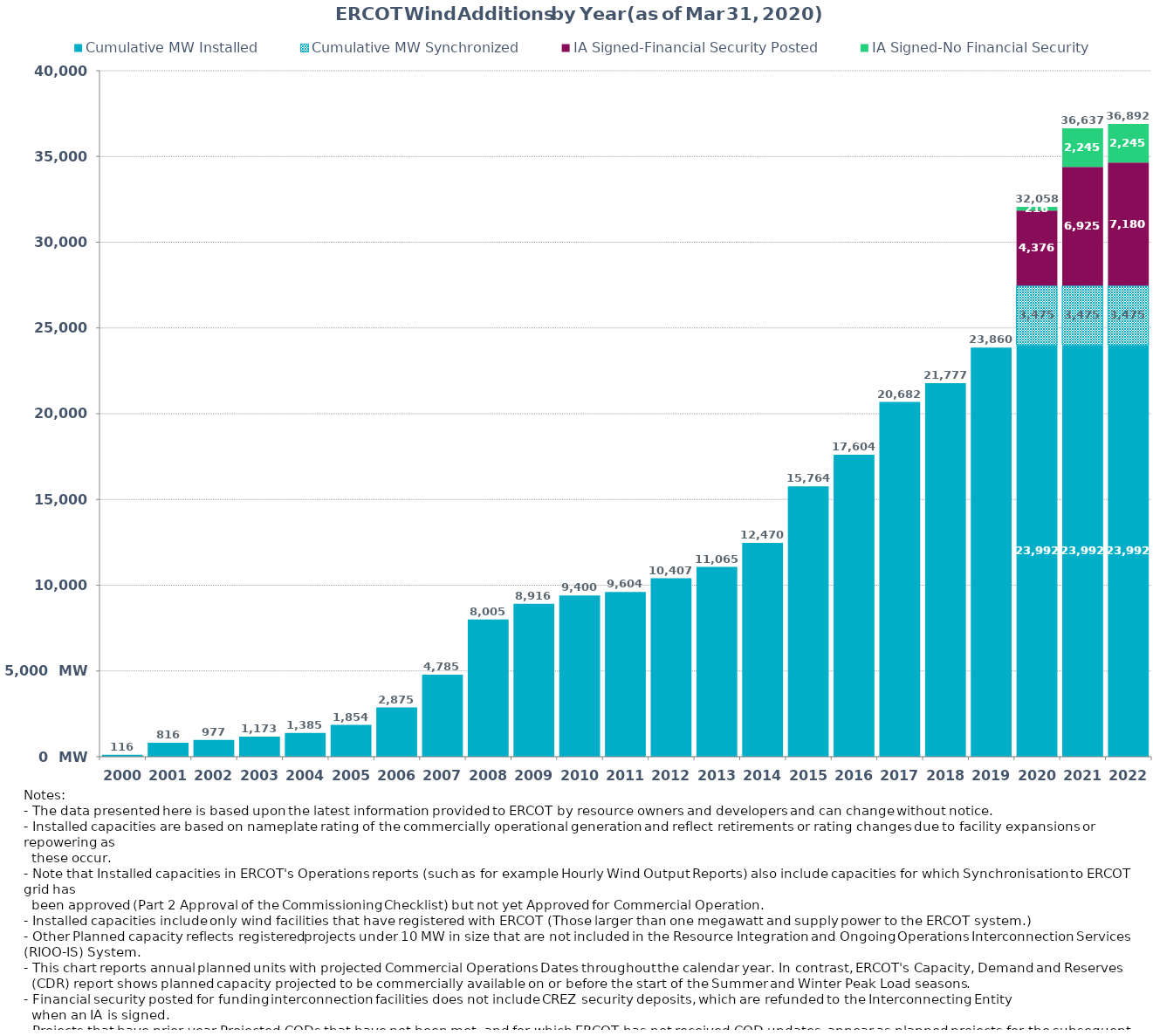
| Category | Cumulative MW Installed | Cumulative MW Synchronized | IA Signed-Financial Security Posted  | IA Signed-No Financial Security  | Other Planned | Cumulative Installed and Planned |
|---|---|---|---|---|---|---|
| 2000.0 | 116 | 0 | 0 | 0 | 0 | 116 |
| 2001.0 | 816 | 0 | 0 | 0 | 0 | 816 |
| 2002.0 | 977 | 0 | 0 | 0 | 0 | 977 |
| 2003.0 | 1173 | 0 | 0 | 0 | 0 | 1173 |
| 2004.0 | 1385 | 0 | 0 | 0 | 0 | 1385 |
| 2005.0 | 1854 | 0 | 0 | 0 | 0 | 1854 |
| 2006.0 | 2875 | 0 | 0 | 0 | 0 | 2875 |
| 2007.0 | 4785 | 0 | 0 | 0 | 0 | 4785 |
| 2008.0 | 8005 | 0 | 0 | 0 | 0 | 8005 |
| 2009.0 | 8916 | 0 | 0 | 0 | 0 | 8916 |
| 2010.0 | 9400 | 0 | 0 | 0 | 0 | 9400 |
| 2011.0 | 9604 | 0 | 0 | 0 | 0 | 9604 |
| 2012.0 | 10407 | 0 | 0 | 0 | 0 | 10407 |
| 2013.0 | 11065 | 0 | 0 | 0 | 0 | 11065 |
| 2014.0 | 12470 | 0 | 0 | 0 | 0 | 12470 |
| 2015.0 | 15764 | 0 | 0 | 0 | 0 | 15764 |
| 2016.0 | 17604 | 0 | 0 | 0 | 0 | 17604 |
| 2017.0 | 20682 | 0 | 0 | 0 | 0 | 20682 |
| 2018.0 | 21777 | 0 | 0 | 0 | 0 | 21777 |
| 2019.0 | 23860 | 0 | 0 | 0 | 0 | 23860 |
| 2020.0 | 23992.24 | 3474.5 | 4375.51 | 215.6 | 0 | 32057.85 |
| 2021.0 | 23992.24 | 3474.5 | 6924.99 | 2244.82 | 0 | 36636.55 |
| 2022.0 | 23992.24 | 3474.5 | 7180.29 | 2244.82 | 0 | 36891.85 |